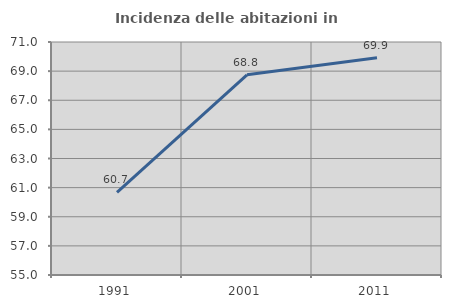
| Category | Incidenza delle abitazioni in proprietà  |
|---|---|
| 1991.0 | 60.68 |
| 2001.0 | 68.75 |
| 2011.0 | 69.914 |